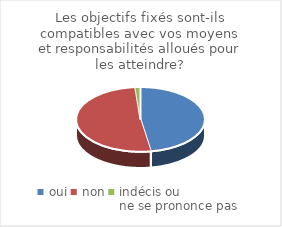
| Category | Les objectifs fixés sont-ils compatibles avec vos moyens et responsabilités alloués pour les atteindre? |
|---|---|
| oui | 37 |
| non | 40 |
| indécis ou 
ne se prononce pas | 1 |